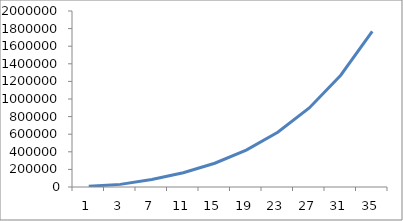
| Category | Series 0 |
|---|---|
| 1.0 | 9000 |
| 3.0 | 29771.1 |
| 7.0 | 84579.212 |
| 11.0 | 162139.068 |
| 15.0 | 270239.428 |
| 19.0 | 419179.833 |
| 23.0 | 622562.254 |
| 27.0 | 898330.19 |
| 31.0 | 1270132.324 |
| 35.0 | 1769111.782 |